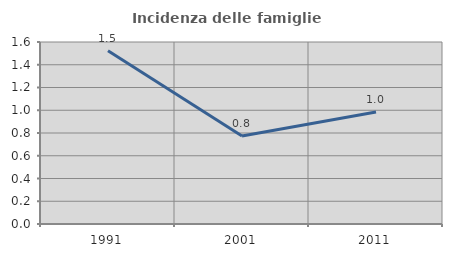
| Category | Incidenza delle famiglie numerose |
|---|---|
| 1991.0 | 1.523 |
| 2001.0 | 0.773 |
| 2011.0 | 0.985 |